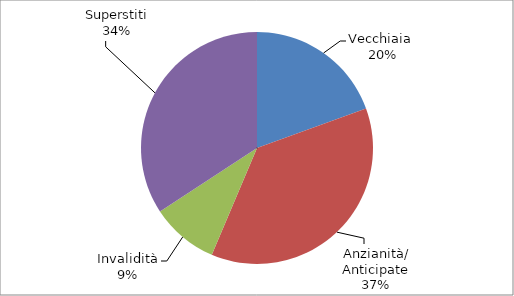
| Category | Series 0 |
|---|---|
| Vecchiaia  | 10741 |
| Anzianità/ Anticipate | 20379 |
| Invalidità | 5189 |
| Superstiti | 18896 |